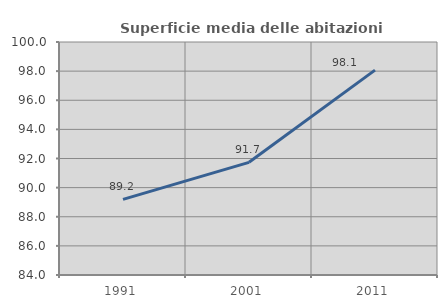
| Category | Superficie media delle abitazioni occupate |
|---|---|
| 1991.0 | 89.197 |
| 2001.0 | 91.737 |
| 2011.0 | 98.07 |